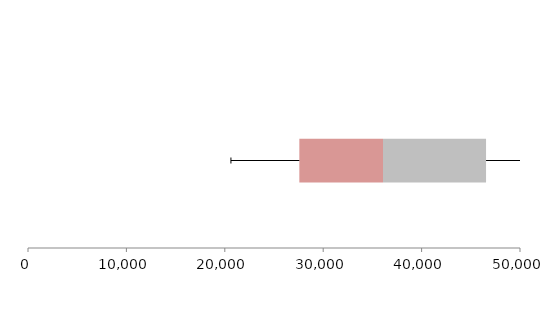
| Category | Series 1 | Series 2 | Series 3 |
|---|---|---|---|
| 0 | 27575.263 | 8502.525 | 10471.827 |